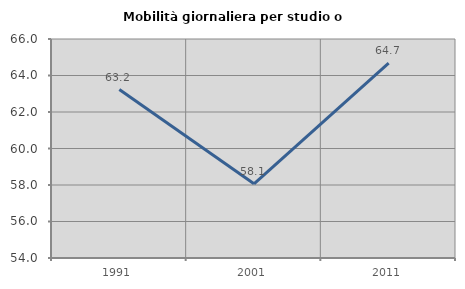
| Category | Mobilità giornaliera per studio o lavoro |
|---|---|
| 1991.0 | 63.233 |
| 2001.0 | 58.065 |
| 2011.0 | 64.677 |